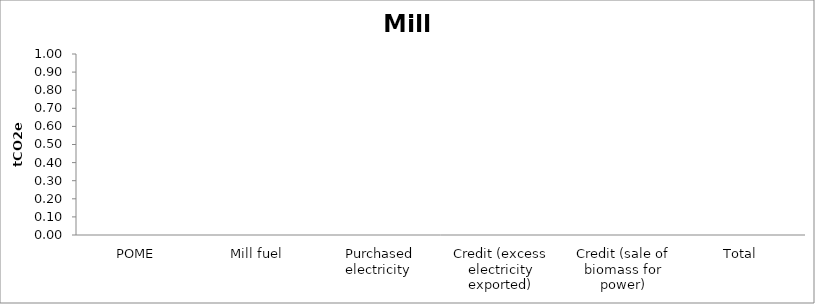
| Category | tCO2e |
|---|---|
| POME | 0 |
| Mill fuel | 0 |
| Purchased electricity  | 0 |
| Credit (excess electricity exported) | 0 |
| Credit (sale of biomass for power) | 0 |
| Total  | 0 |